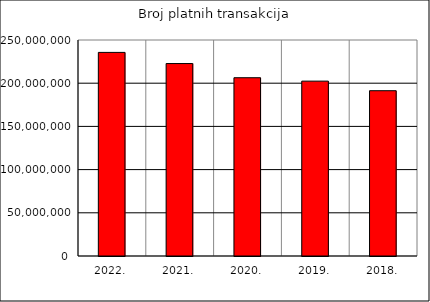
| Category | Broj platnih transakcija |
|---|---|
| 2022. | 235647669 |
| 2021. | 222739691 |
| 2020. | 206334436 |
| 2019. | 202391763 |
| 2018. | 191309343 |